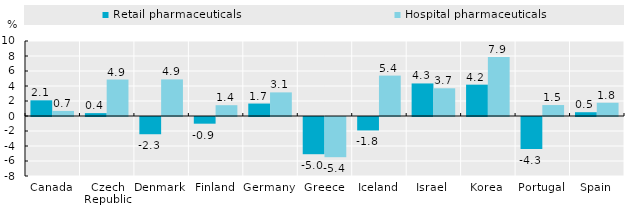
| Category | Retail pharmaceuticals | Hospital pharmaceuticals |
|---|---|---|
| Canada | 2.091 | 0.676 |
| Czech Republic | 0.382 | 4.86 |
| Denmark | -2.298 | 4.879 |
| Finland | -0.891 | 1.441 |
| Germany | 1.658 | 3.148 |
| Greece | -4.961 | -5.359 |
| Iceland | -1.791 | 5.388 |
| Israel | 4.34 | 3.693 |
| Korea | 4.178 | 7.85 |
| Portugal | -4.264 | 1.461 |
| Spain | 0.504 | 1.765 |